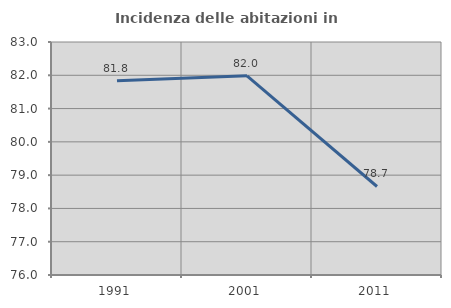
| Category | Incidenza delle abitazioni in proprietà  |
|---|---|
| 1991.0 | 81.833 |
| 2001.0 | 81.984 |
| 2011.0 | 78.659 |